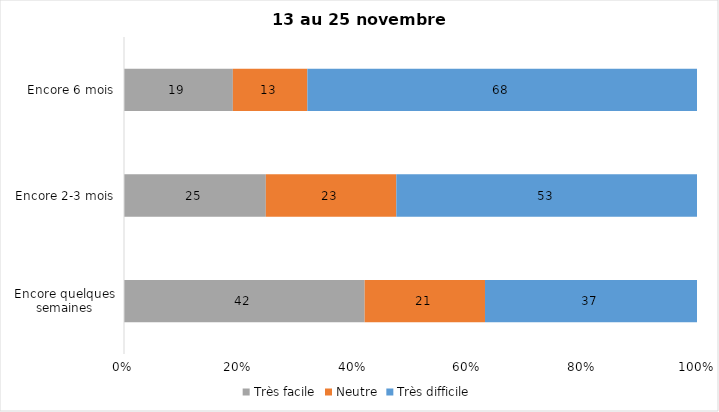
| Category | Très facile | Neutre | Très difficile |
|---|---|---|---|
| Encore quelques semaines | 42 | 21 | 37 |
| Encore 2-3 mois | 25 | 23 | 53 |
| Encore 6 mois | 19 | 13 | 68 |